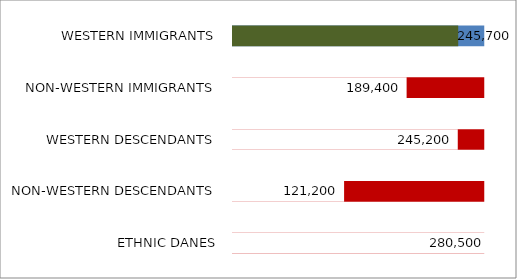
| Category | gennemsnit | Landet |
|---|---|---|
| ETHNIC DANES | 274100 | 280500 |
| NON-WESTERN DESCENDANTS | 0 | 121200 |
| WESTERN DESCENDANTS | 0 | 245200 |
| NON-WESTERN IMMIGRANTS | 0 | 189400 |
| WESTERN IMMIGRANTS | 0 | 245700 |